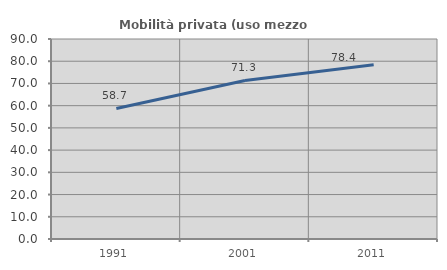
| Category | Mobilità privata (uso mezzo privato) |
|---|---|
| 1991.0 | 58.73 |
| 2001.0 | 71.346 |
| 2011.0 | 78.362 |